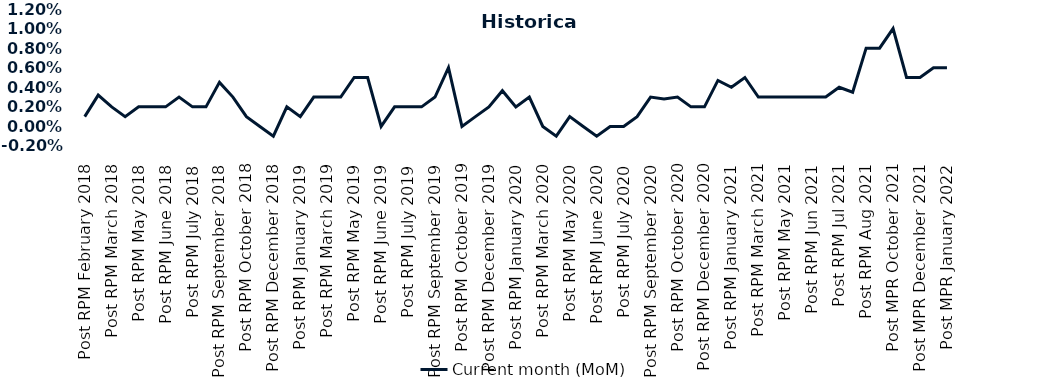
| Category | Current month (MoM)  |
|---|---|
| Post RPM February 2018 | 0.001 |
| Pre RPM March 2018 | 0.003 |
| Post RPM March 2018 | 0.002 |
| Pre RPM May 2018 | 0.001 |
| Post RPM May 2018 | 0.002 |
| Pre RPM June 2018 | 0.002 |
| Post RPM June 2018 | 0.002 |
| Pre RPM July 2018 | 0.003 |
| Post RPM July 2018 | 0.002 |
| Pre RPM September 2018 | 0.002 |
| Post RPM September 2018 | 0.004 |
| Pre RPM October 2018 | 0.003 |
| Post RPM October 2018 | 0.001 |
| Pre RPM December 2018 | 0 |
| Post RPM December 2018 | -0.001 |
| Pre RPM January 2019 | 0.002 |
| Post RPM January 2019 | 0.001 |
| Pre RPM March 2019 | 0.003 |
| Post RPM March 2019 | 0.003 |
| Pre RPM May 2019 | 0.003 |
| Post RPM May 2019 | 0.005 |
| Pre RPM June 2019 | 0.005 |
| Post RPM June 2019 | 0 |
| Pre RPM July 2019 | 0.002 |
| Post RPM July 2019 | 0.002 |
| Pre RPM September 2019 | 0.002 |
| Post RPM September 2019 | 0.003 |
| Pre RPM October 2019 | 0.006 |
| Post RPM October 2019 | 0 |
| Pre RPM December 2019 | 0.001 |
| Post RPM December 2019 | 0.002 |
| Pre RPM January 2020 | 0.004 |
| Post RPM January 2020 | 0.002 |
| Pre RPM March 2020 | 0.003 |
| Post RPM March 2020 | 0 |
| Pre RPM May 2020 | -0.001 |
| Post RPM May 2020 | 0.001 |
| Pre RPM June 2020 | 0 |
| Post RPM June 2020 | -0.001 |
| Pre RPM July 2020 | 0 |
| Post RPM July 2020 | 0 |
| Pre RPM September 2020 | 0.001 |
| Post RPM September 2020 | 0.003 |
| Pre RPM October 2020 | 0.003 |
| Post RPM October 2020 | 0.003 |
| Pre RPM December 2020 | 0.002 |
|  Post RPM December 2020 | 0.002 |
| Pre RPM January 2021 | 0.005 |
| Post RPM January 2021 | 0.004 |
|  Pre RPM March 2021 | 0.005 |
|  Post RPM March 2021 | 0.003 |
|  Pre RPM May 2021 | 0.003 |
|  Post RPM May 2021 | 0.003 |
|  Pre RPM Jun 2021 | 0.003 |
|   Post RPM Jun 2021 | 0.003 |
| Pre RPM Jul 2021 | 0.003 |
|  Post RPM Jul 2021 | 0.004 |
| Pre RPM Aug 2021 | 0.004 |
|  Post RPM Aug 2021 | 0.008 |
| Pre MPR October 2021 | 0.008 |
| Post MPR October 2021 | 0.01 |
| Pre MPR December 2021 | 0.005 |
| Post MPR December 2021 | 0.005 |
| Pre MPR January 2022 | 0.006 |
| Post MPR January 2022 | 0.006 |